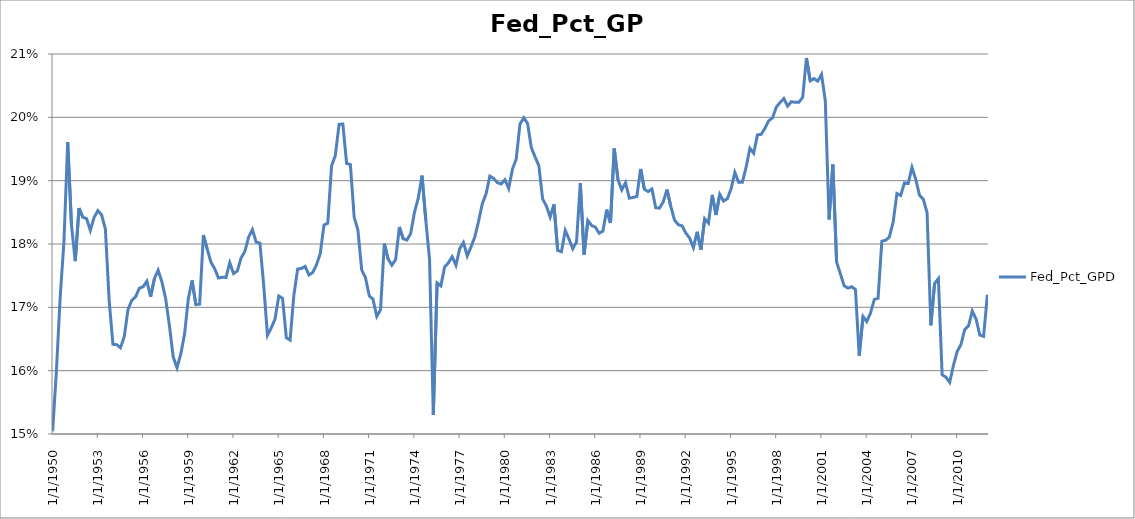
| Category | Fed_Pct_GPD |
|---|---|
| 1/1/50 | 0.15 |
| 4/1/50 | 0.16 |
| 7/1/50 | 0.172 |
| 10/1/50 | 0.18 |
| 1/1/51 | 0.196 |
| 4/1/51 | 0.183 |
| 7/1/51 | 0.177 |
| 10/1/51 | 0.186 |
| 1/1/52 | 0.184 |
| 4/1/52 | 0.184 |
| 7/1/52 | 0.182 |
| 10/1/52 | 0.184 |
| 1/1/53 | 0.185 |
| 4/1/53 | 0.185 |
| 7/1/53 | 0.182 |
| 10/1/53 | 0.171 |
| 1/1/54 | 0.164 |
| 4/1/54 | 0.164 |
| 7/1/54 | 0.164 |
| 10/1/54 | 0.165 |
| 1/1/55 | 0.17 |
| 4/1/55 | 0.171 |
| 7/1/55 | 0.172 |
| 10/1/55 | 0.173 |
| 1/1/56 | 0.173 |
| 4/1/56 | 0.174 |
| 7/1/56 | 0.172 |
| 10/1/56 | 0.175 |
| 1/1/57 | 0.176 |
| 4/1/57 | 0.174 |
| 7/1/57 | 0.171 |
| 10/1/57 | 0.167 |
| 1/1/58 | 0.162 |
| 4/1/58 | 0.16 |
| 7/1/58 | 0.163 |
| 10/1/58 | 0.166 |
| 1/1/59 | 0.171 |
| 4/1/59 | 0.174 |
| 7/1/59 | 0.17 |
| 10/1/59 | 0.17 |
| 1/1/60 | 0.181 |
| 4/1/60 | 0.179 |
| 7/1/60 | 0.177 |
| 10/1/60 | 0.176 |
| 1/1/61 | 0.175 |
| 4/1/61 | 0.175 |
| 7/1/61 | 0.175 |
| 10/1/61 | 0.177 |
| 1/1/62 | 0.175 |
| 4/1/62 | 0.176 |
| 7/1/62 | 0.178 |
| 10/1/62 | 0.179 |
| 1/1/63 | 0.181 |
| 4/1/63 | 0.182 |
| 7/1/63 | 0.18 |
| 10/1/63 | 0.18 |
| 1/1/64 | 0.173 |
| 4/1/64 | 0.166 |
| 7/1/64 | 0.167 |
| 10/1/64 | 0.168 |
| 1/1/65 | 0.172 |
| 4/1/65 | 0.171 |
| 7/1/65 | 0.165 |
| 10/1/65 | 0.165 |
| 1/1/66 | 0.172 |
| 4/1/66 | 0.176 |
| 7/1/66 | 0.176 |
| 10/1/66 | 0.176 |
| 1/1/67 | 0.175 |
| 4/1/67 | 0.175 |
| 7/1/67 | 0.177 |
| 10/1/67 | 0.178 |
| 1/1/68 | 0.183 |
| 4/1/68 | 0.183 |
| 7/1/68 | 0.192 |
| 10/1/68 | 0.194 |
| 1/1/69 | 0.199 |
| 4/1/69 | 0.199 |
| 7/1/69 | 0.193 |
| 10/1/69 | 0.193 |
| 1/1/70 | 0.184 |
| 4/1/70 | 0.182 |
| 7/1/70 | 0.176 |
| 10/1/70 | 0.175 |
| 1/1/71 | 0.172 |
| 4/1/71 | 0.171 |
| 7/1/71 | 0.169 |
| 10/1/71 | 0.17 |
| 1/1/72 | 0.18 |
| 4/1/72 | 0.178 |
| 7/1/72 | 0.177 |
| 10/1/72 | 0.178 |
| 1/1/73 | 0.183 |
| 4/1/73 | 0.181 |
| 7/1/73 | 0.181 |
| 10/1/73 | 0.182 |
| 1/1/74 | 0.185 |
| 4/1/74 | 0.187 |
| 7/1/74 | 0.191 |
| 10/1/74 | 0.184 |
| 1/1/75 | 0.178 |
| 4/1/75 | 0.153 |
| 7/1/75 | 0.174 |
| 10/1/75 | 0.173 |
| 1/1/76 | 0.176 |
| 4/1/76 | 0.177 |
| 7/1/76 | 0.178 |
| 10/1/76 | 0.177 |
| 1/1/77 | 0.179 |
| 4/1/77 | 0.18 |
| 7/1/77 | 0.178 |
| 10/1/77 | 0.18 |
| 1/1/78 | 0.181 |
| 4/1/78 | 0.184 |
| 7/1/78 | 0.186 |
| 10/1/78 | 0.188 |
| 1/1/79 | 0.191 |
| 4/1/79 | 0.19 |
| 7/1/79 | 0.19 |
| 10/1/79 | 0.189 |
| 1/1/80 | 0.19 |
| 4/1/80 | 0.189 |
| 7/1/80 | 0.192 |
| 10/1/80 | 0.193 |
| 1/1/81 | 0.199 |
| 4/1/81 | 0.2 |
| 7/1/81 | 0.199 |
| 10/1/81 | 0.195 |
| 1/1/82 | 0.194 |
| 4/1/82 | 0.192 |
| 7/1/82 | 0.187 |
| 10/1/82 | 0.186 |
| 1/1/83 | 0.184 |
| 4/1/83 | 0.186 |
| 7/1/83 | 0.179 |
| 10/1/83 | 0.179 |
| 1/1/84 | 0.182 |
| 4/1/84 | 0.181 |
| 7/1/84 | 0.179 |
| 10/1/84 | 0.18 |
| 1/1/85 | 0.19 |
| 4/1/85 | 0.178 |
| 7/1/85 | 0.184 |
| 10/1/85 | 0.183 |
| 1/1/86 | 0.183 |
| 4/1/86 | 0.182 |
| 7/1/86 | 0.182 |
| 10/1/86 | 0.185 |
| 1/1/87 | 0.183 |
| 4/1/87 | 0.195 |
| 7/1/87 | 0.19 |
| 10/1/87 | 0.189 |
| 1/1/88 | 0.19 |
| 4/1/88 | 0.187 |
| 7/1/88 | 0.187 |
| 10/1/88 | 0.188 |
| 1/1/89 | 0.192 |
| 4/1/89 | 0.189 |
| 7/1/89 | 0.188 |
| 10/1/89 | 0.189 |
| 1/1/90 | 0.186 |
| 4/1/90 | 0.186 |
| 7/1/90 | 0.187 |
| 10/1/90 | 0.189 |
| 1/1/91 | 0.186 |
| 4/1/91 | 0.184 |
| 7/1/91 | 0.183 |
| 10/1/91 | 0.183 |
| 1/1/92 | 0.182 |
| 4/1/92 | 0.181 |
| 7/1/92 | 0.179 |
| 10/1/92 | 0.182 |
| 1/1/93 | 0.179 |
| 4/1/93 | 0.184 |
| 7/1/93 | 0.183 |
| 10/1/93 | 0.188 |
| 1/1/94 | 0.185 |
| 4/1/94 | 0.188 |
| 7/1/94 | 0.187 |
| 10/1/94 | 0.187 |
| 1/1/95 | 0.189 |
| 4/1/95 | 0.191 |
| 7/1/95 | 0.19 |
| 10/1/95 | 0.19 |
| 1/1/96 | 0.192 |
| 4/1/96 | 0.195 |
| 7/1/96 | 0.194 |
| 10/1/96 | 0.197 |
| 1/1/97 | 0.197 |
| 4/1/97 | 0.198 |
| 7/1/97 | 0.199 |
| 10/1/97 | 0.2 |
| 1/1/98 | 0.202 |
| 4/1/98 | 0.202 |
| 7/1/98 | 0.203 |
| 10/1/98 | 0.202 |
| 1/1/99 | 0.202 |
| 4/1/99 | 0.202 |
| 7/1/99 | 0.202 |
| 10/1/99 | 0.203 |
| 1/1/00 | 0.209 |
| 4/1/00 | 0.206 |
| 7/1/00 | 0.206 |
| 10/1/00 | 0.206 |
| 1/1/01 | 0.207 |
| 4/1/01 | 0.203 |
| 7/1/01 | 0.184 |
| 10/1/01 | 0.193 |
| 1/1/02 | 0.177 |
| 4/1/02 | 0.175 |
| 7/1/02 | 0.173 |
| 10/1/02 | 0.173 |
| 1/1/03 | 0.173 |
| 4/1/03 | 0.173 |
| 7/1/03 | 0.162 |
| 10/1/03 | 0.169 |
| 1/1/04 | 0.168 |
| 4/1/04 | 0.169 |
| 7/1/04 | 0.171 |
| 10/1/04 | 0.171 |
| 1/1/05 | 0.18 |
| 4/1/05 | 0.181 |
| 7/1/05 | 0.181 |
| 10/1/05 | 0.183 |
| 1/1/06 | 0.188 |
| 4/1/06 | 0.188 |
| 7/1/06 | 0.19 |
| 10/1/06 | 0.19 |
| 1/1/07 | 0.192 |
| 4/1/07 | 0.19 |
| 7/1/07 | 0.188 |
| 10/1/07 | 0.187 |
| 1/1/08 | 0.185 |
| 4/1/08 | 0.167 |
| 7/1/08 | 0.174 |
| 10/1/08 | 0.175 |
| 1/1/09 | 0.159 |
| 4/1/09 | 0.159 |
| 7/1/09 | 0.158 |
| 10/1/09 | 0.161 |
| 1/1/10 | 0.163 |
| 4/1/10 | 0.164 |
| 7/1/10 | 0.167 |
| 10/1/10 | 0.167 |
| 1/1/11 | 0.169 |
| 4/1/11 | 0.168 |
| 7/1/11 | 0.166 |
| 10/1/11 | 0.165 |
| 1/1/12 | 0.172 |